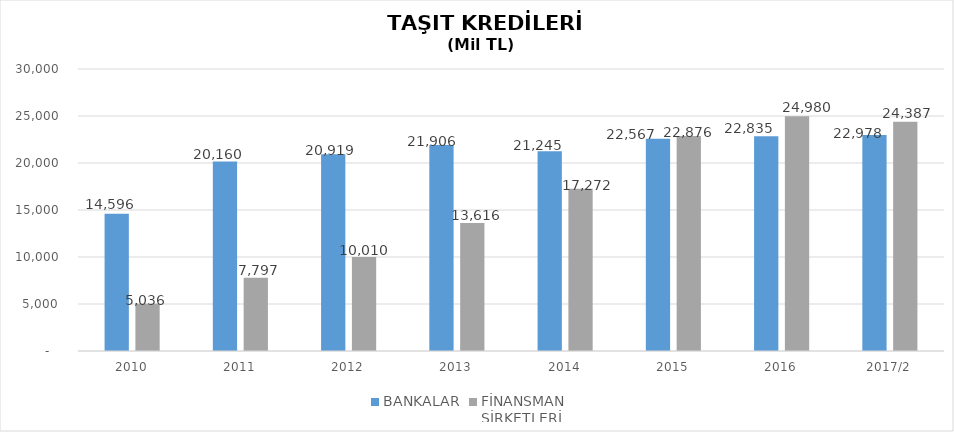
| Category | BANKALAR | FİNANSMAN 
ŞİRKETLERİ |
|---|---|---|
| 2010 | 14596 | 5035.89 |
| 2011 | 20160 | 7796.854 |
| 2012 | 20919 | 10009.755 |
| 2013 | 21906 | 13616.036 |
| 2014 | 21245 | 17271.844 |
| 2015 | 22567 | 22875.563 |
| 2016 | 22835 | 24980.231 |
| 2017/2 | 22978 | 24387.461 |